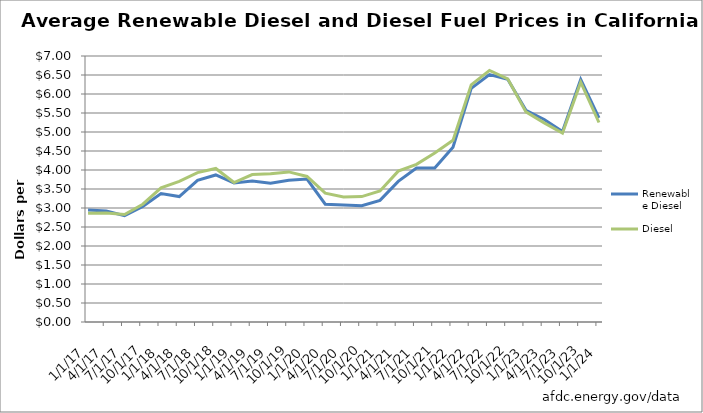
| Category | Renewable Diesel | Diesel |
|---|---|---|
| 1/1/17 | 2.95 | 2.86 |
| 4/1/17 | 2.92 | 2.87 |
| 7/1/17 | 2.8 | 2.83 |
| 10/1/17 | 3.04 | 3.1 |
| 1/1/18 | 3.38 | 3.53 |
| 4/1/18 | 3.3 | 3.7 |
| 7/1/18 | 3.73 | 3.93 |
| 10/1/18 | 3.87 | 4.04 |
| 1/1/19 | 3.66 | 3.67 |
| 4/1/19 | 3.71 | 3.88 |
| 7/1/19 | 3.65 | 3.9 |
| 10/1/19 | 3.73 | 3.95 |
| 1/1/20 | 3.76 | 3.83 |
| 4/1/20 | 3.1 | 3.39 |
| 7/1/20 | 3.08 | 3.29 |
| 10/1/20 | 3.06 | 3.3 |
| 1/1/21 | 3.2 | 3.45 |
| 4/1/21 | 3.7 | 3.97 |
| 7/1/21 | 4.05 | 4.15 |
| 10/1/21 | 4.05 | 4.45 |
| 1/1/22 | 4.6 | 4.78 |
| 4/1/22 | 6.15 | 6.24 |
| 7/1/22 | 6.51 | 6.62 |
| 10/1/22 | 6.39 | 6.4 |
| 1/1/23 | 5.57 | 5.53 |
| 4/1/23 | 5.33 | 5.24 |
| 7/1/23 | 5.01 | 4.97 |
| 10/1/23 | 6.38 | 6.31 |
| 1/1/24 | 5.37 | 5.25 |